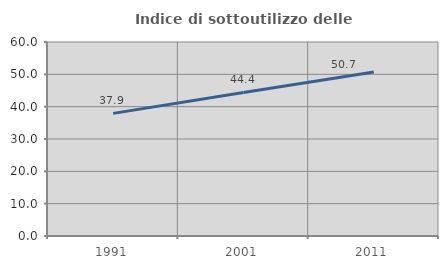
| Category | Indice di sottoutilizzo delle abitazioni  |
|---|---|
| 1991.0 | 37.929 |
| 2001.0 | 44.382 |
| 2011.0 | 50.723 |